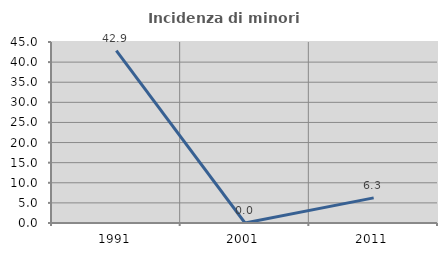
| Category | Incidenza di minori stranieri |
|---|---|
| 1991.0 | 42.857 |
| 2001.0 | 0 |
| 2011.0 | 6.25 |